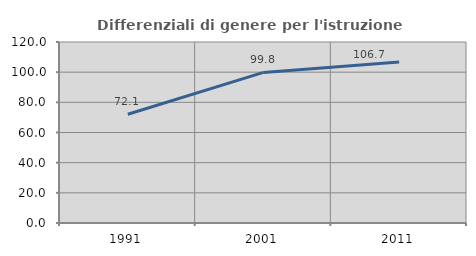
| Category | Differenziali di genere per l'istruzione superiore |
|---|---|
| 1991.0 | 72.061 |
| 2001.0 | 99.819 |
| 2011.0 | 106.748 |